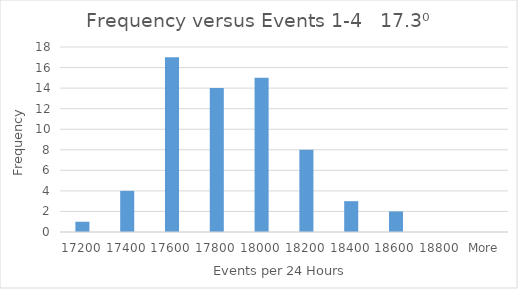
| Category | Frequency |
|---|---|
| 17200 | 1 |
| 17400 | 4 |
| 17600 | 17 |
| 17800 | 14 |
| 18000 | 15 |
| 18200 | 8 |
| 18400 | 3 |
| 18600 | 2 |
| 18800 | 0 |
| More | 0 |